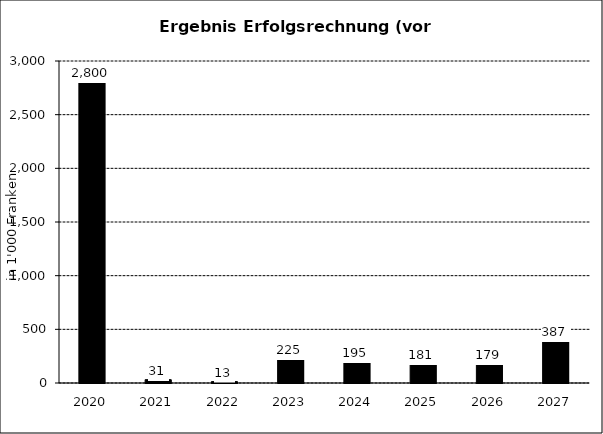
| Category | Ergebnis Laufenden Rechnung (vor Abschluss) |
|---|---|
| 2020.0 | 2800 |
| 2021.0 | 31 |
| 2022.0 | 13 |
| 2023.0 | 225.362 |
| 2024.0 | 194.747 |
| 2025.0 | 180.958 |
| 2026.0 | 179.209 |
| 2027.0 | 386.774 |